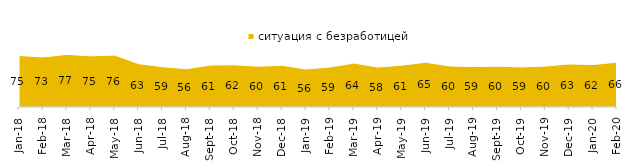
| Category | ситуация с безработицей |
|---|---|
| 2018-01-01 | 75.4 |
| 2018-02-01 | 73.25 |
| 2018-03-01 | 76.95 |
| 2018-04-01 | 74.85 |
| 2018-05-01 | 76 |
| 2018-06-01 | 63.4 |
| 2018-07-01 | 59 |
| 2018-08-01 | 56 |
| 2018-09-01 | 61.35 |
| 2018-10-01 | 61.75 |
| 2018-11-01 | 59.78 |
| 2018-12-01 | 60.95 |
| 2019-01-01 | 55.55 |
| 2019-02-01 | 58.5 |
| 2019-03-01 | 64.296 |
| 2019-04-01 | 58.416 |
| 2019-05-01 | 61.169 |
| 2019-06-01 | 65.436 |
| 2019-07-01 | 60.099 |
| 2019-08-01 | 59.241 |
| 2019-09-01 | 59.703 |
| 2019-10-01 | 58.614 |
| 2019-11-01 | 59.851 |
| 2019-12-01 | 63.02 |
| 2020-01-01 | 62.129 |
| 2020-02-01 | 65.594 |